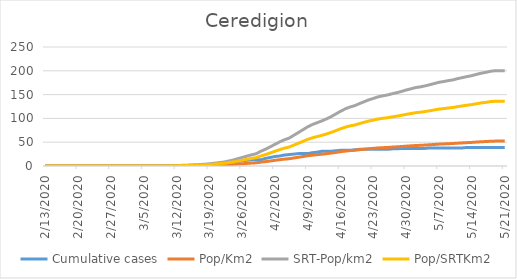
| Category | Cumulative cases | Pop/Km2 | SRT-Pop/km2 | Pop/SRTKm2 |
|---|---|---|---|---|
| 5/21/20 | 39 | 52.299 | 200.198 | 136.061 |
| 5/20/20 | 39 | 52.299 | 200.198 | 136.061 |
| 5/19/20 | 39 | 52.287 | 200.151 | 136.029 |
| 5/18/20 | 39 | 52 | 199.053 | 135.284 |
| 5/17/20 | 39 | 51.39 | 196.718 | 133.696 |
| 5/16/20 | 39 | 50.936 | 194.977 | 132.514 |
| 5/15/20 | 39 | 50.297 | 192.532 | 130.852 |
| 5/14/20 | 39 | 49.588 | 189.82 | 129.009 |
| 5/13/20 | 39 | 49.097 | 187.939 | 127.73 |
| 5/12/20 | 38 | 48.532 | 185.776 | 126.26 |
| 5/11/20 | 38 | 47.971 | 183.628 | 124.8 |
| 5/10/20 | 38 | 47.275 | 180.963 | 122.989 |
| 5/9/20 | 38 | 46.869 | 179.411 | 121.934 |
| 5/8/20 | 38 | 46.361 | 177.467 | 120.613 |
| 5/7/20 | 38 | 45.952 | 175.9 | 119.548 |
| 5/6/20 | 38 | 45.276 | 173.313 | 117.79 |
| 5/5/20 | 38 | 44.6 | 170.727 | 116.032 |
| 5/4/20 | 37 | 43.949 | 168.234 | 114.338 |
| 5/3/20 | 37 | 43.425 | 166.228 | 112.974 |
| 5/2/20 | 37 | 43.04 | 164.754 | 111.973 |
| 5/1/20 | 37 | 42.356 | 162.136 | 110.194 |
| 4/30/20 | 37 | 41.709 | 159.66 | 108.51 |
| 4/29/20 | 37 | 40.923 | 156.65 | 106.465 |
| 4/28/20 | 36 | 40.255 | 154.095 | 104.728 |
| 4/27/20 | 36 | 39.658 | 151.806 | 103.173 |
| 4/26/20 | 35 | 38.986 | 149.235 | 101.425 |
| 4/25/20 | 35 | 38.499 | 147.37 | 100.158 |
| 4/24/20 | 35 | 37.946 | 145.253 | 98.719 |
| 4/23/20 | 35 | 37.098 | 142.008 | 96.514 |
| 4/22/20 | 35 | 36.287 | 138.905 | 94.405 |
| 4/21/20 | 35 | 35.259 | 134.97 | 91.73 |
| 4/20/20 | 35 | 34.223 | 131.004 | 89.035 |
| 4/19/20 | 34 | 33.097 | 126.693 | 86.105 |
| 4/18/20 | 33 | 32.368 | 123.903 | 84.209 |
| 4/17/20 | 33 | 31.373 | 120.093 | 81.62 |
| 4/16/20 | 33 | 30.054 | 115.046 | 78.189 |
| 4/15/20 | 32 | 28.584 | 109.418 | 74.364 |
| 4/14/20 | 31 | 27.13 | 103.853 | 70.582 |
| 4/13/20 | 31 | 25.861 | 98.994 | 67.28 |
| 4/12/20 | 31 | 24.768 | 94.808 | 64.435 |
| 4/11/20 | 29 | 23.772 | 90.999 | 61.846 |
| 4/10/20 | 28 | 22.773 | 87.174 | 59.247 |
| 4/9/20 | 26 | 21.545 | 82.471 | 56.05 |
| 4/8/20 | 26 | 19.948 | 76.358 | 51.895 |
| 4/7/20 | 26 | 18.379 | 70.354 | 47.815 |
| 4/6/20 | 25 | 16.839 | 64.46 | 43.809 |
| 4/5/20 | 24 | 15.287 | 58.518 | 39.771 |
| 4/4/20 | 23 | 14.382 | 55.054 | 37.417 |
| 4/3/20 | 21 | 13.231 | 50.649 | 34.423 |
| 4/2/20 | 20 | 11.905 | 45.57 | 30.971 |
| 4/1/20 | 18 | 10.541 | 40.35 | 27.423 |
| 3/31/20 | 16 | 9.23 | 35.334 | 24.014 |
| 3/30/20 | 13 | 8.121 | 31.085 | 21.127 |
| 3/29/20 | 13 | 6.753 | 25.85 | 17.568 |
| 3/28/20 | 13 | 6.114 | 23.404 | 15.906 |
| 3/27/20 | 12 | 5.434 | 20.802 | 14.138 |
| 3/26/20 | 11 | 4.677 | 17.902 | 12.167 |
| 3/25/20 | 9 | 3.964 | 15.174 | 10.313 |
| 3/24/20 | 7 | 3.215 | 12.306 | 8.363 |
| 3/23/20 | 6 | 2.662 | 10.189 | 6.925 |
| 3/22/20 | 6 | 2.129 | 8.151 | 5.54 |
| 3/21/20 | 4 | 1.818 | 6.96 | 4.73 |
| 3/20/20 | 1 | 1.511 | 5.784 | 3.931 |
| 3/19/20 | 1 | 1.216 | 4.656 | 3.164 |
| 3/18/20 | 1 | 0.971 | 3.715 | 2.525 |
| 3/17/20 | 1 | 0.827 | 3.167 | 2.152 |
| 3/16/20 | 1 | 0.676 | 2.587 | 1.758 |
| 3/15/20 | 1 | 0.536 | 2.054 | 1.396 |
| 3/14/20 | 1 | 0.418 | 1.599 | 1.087 |
| 3/13/20 | 1 | 0.34 | 1.301 | 0.884 |
| 3/12/20 | 0 | 0.229 | 0.878 | 0.597 |
| 3/11/20 | 0 | 0.131 | 0.502 | 0.341 |
| 3/10/20 | 0 | 0.074 | 0.282 | 0.192 |
| 3/9/20 | 0 | 0.029 | 0.11 | 0.075 |
| 3/8/20 | 0 | 0.016 | 0.063 | 0.043 |
| 3/7/20 | 0 | 0.016 | 0.063 | 0.043 |
| 3/6/20 | 0 | 0.008 | 0.031 | 0.021 |
| 3/5/20 | 0 | 0.008 | 0.031 | 0.021 |
| 3/4/20 | 0 | 0.008 | 0.031 | 0.021 |
| 3/3/20 | 0 | 0.004 | 0.016 | 0.011 |
| 3/2/20 | 0 | 0.004 | 0.016 | 0.011 |
| 3/1/20 | 0 | 0.004 | 0.016 | 0.011 |
| 2/29/20 | 0 | 0.004 | 0.016 | 0.011 |
| 2/28/20 | 0 | 0.004 | 0.016 | 0.011 |
| 2/27/20 | 0 | 0.004 | 0.016 | 0.011 |
| 2/26/20 | 0 | 0 | 0 | 0 |
| 2/25/20 | 0 | 0 | 0 | 0 |
| 2/24/20 | 0 | 0 | 0 | 0 |
| 2/23/20 | 0 | 0 | 0 | 0 |
| 2/22/20 | 0 | 0 | 0 | 0 |
| 2/21/20 | 0 | 0 | 0 | 0 |
| 2/20/20 | 0 | 0 | 0 | 0 |
| 2/19/20 | 0 | 0 | 0 | 0 |
| 2/18/20 | 0 | 0 | 0 | 0 |
| 2/17/20 | 0 | 0 | 0 | 0 |
| 2/16/20 | 0 | 0 | 0 | 0 |
| 2/15/20 | 0 | 0 | 0 | 0 |
| 2/14/20 | 0 | 0 | 0 | 0 |
| 2/13/20 | 0 | 0 | 0 | 0 |